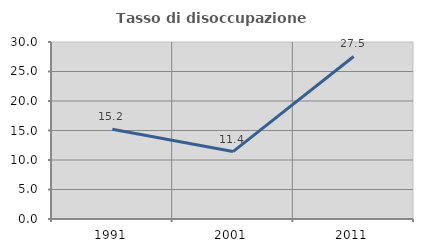
| Category | Tasso di disoccupazione giovanile  |
|---|---|
| 1991.0 | 15.217 |
| 2001.0 | 11.429 |
| 2011.0 | 27.547 |